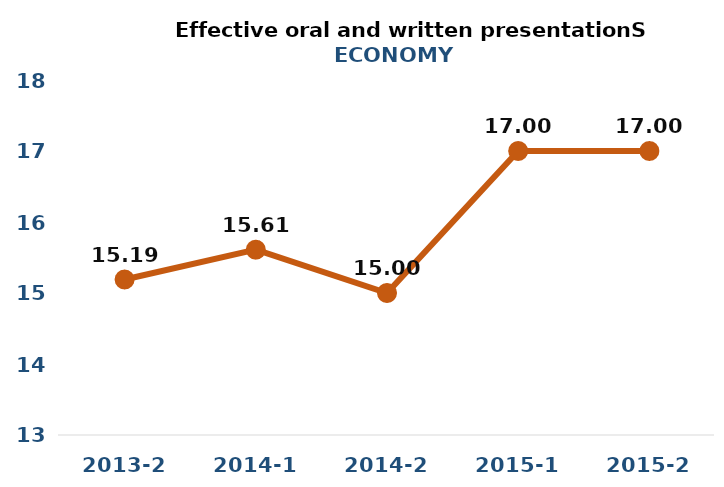
| Category | Series 0 |
|---|---|
| 2013-2 | 15.19 |
| 2014-1 | 15.61 |
| 2014-2 | 15 |
| 2015-1 | 17 |
| 2015-2 | 17 |